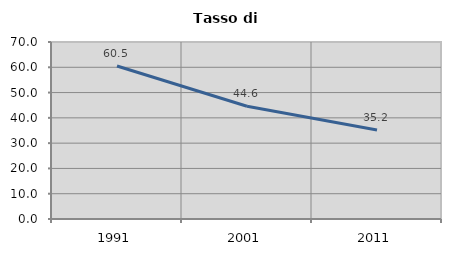
| Category | Tasso di disoccupazione   |
|---|---|
| 1991.0 | 60.492 |
| 2001.0 | 44.571 |
| 2011.0 | 35.195 |